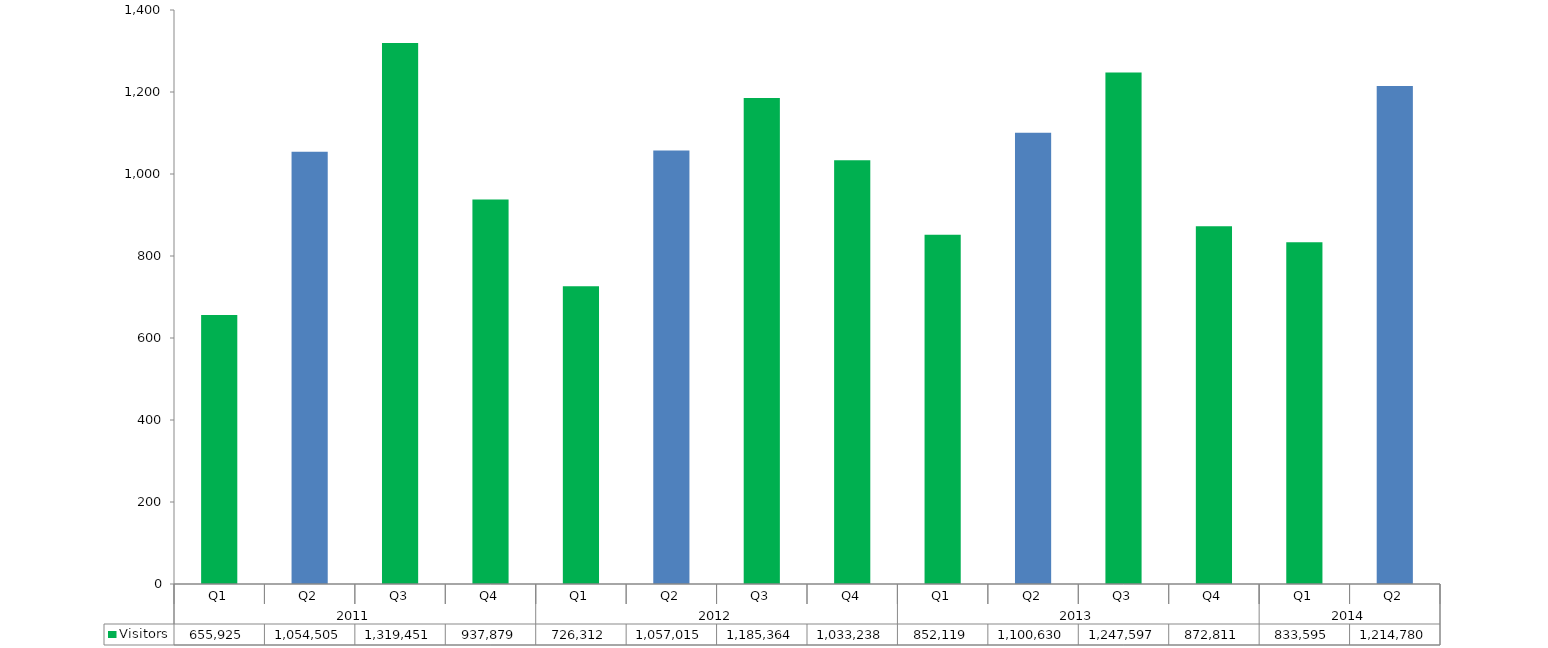
| Category | Visitors  |
|---|---|
| 0 | 655925 |
| 1 | 1054505 |
| 2 | 1319451 |
| 3 | 937879 |
| 4 | 726312 |
| 5 | 1057015 |
| 6 | 1185364 |
| 7 | 1033238 |
| 8 | 852119 |
| 9 | 1100630 |
| 10 | 1247597 |
| 11 | 872811 |
| 12 | 833595 |
| 13 | 1214780 |